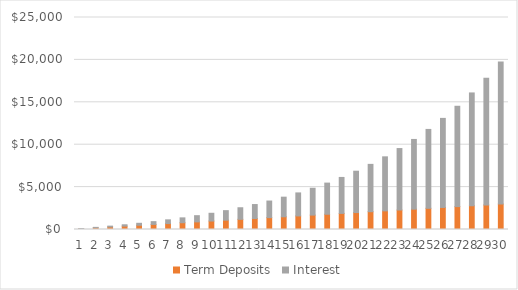
| Category | Term Deposits | Interest |
|---|---|---|
| 0 | 100 | 20 |
| 1 | 200 | 52 |
| 2 | 300 | 97.2 |
| 3 | 400 | 156.92 |
| 4 | 500 | 232.612 |
| 5 | 600 | 325.873 |
| 6 | 700 | 438.461 |
| 7 | 800 | 572.307 |
| 8 | 900 | 729.537 |
| 9 | 1000 | 912.491 |
| 10 | 1100 | 1123.74 |
| 11 | 1200 | 1366.114 |
| 12 | 1300 | 1642.725 |
| 13 | 1400 | 1956.998 |
| 14 | 1500 | 2312.698 |
| 15 | 1600 | 2713.968 |
| 16 | 1700 | 3165.364 |
| 17 | 1800 | 3671.901 |
| 18 | 1900 | 4239.091 |
| 19 | 2000 | 4873 |
| 20 | 2100 | 5580.3 |
| 21 | 2200 | 6368.33 |
| 22 | 2300 | 7245.163 |
| 23 | 2400 | 8219.679 |
| 24 | 2500 | 9301.647 |
| 25 | 2600 | 10501.812 |
| 26 | 2700 | 11831.993 |
| 27 | 2800 | 13305.192 |
| 28 | 2900 | 14935.712 |
| 29 | 3000 | 16739.283 |